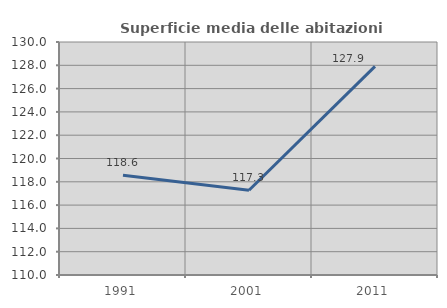
| Category | Superficie media delle abitazioni occupate |
|---|---|
| 1991.0 | 118.565 |
| 2001.0 | 117.273 |
| 2011.0 | 127.907 |